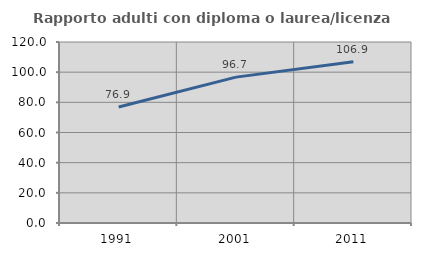
| Category | Rapporto adulti con diploma o laurea/licenza media  |
|---|---|
| 1991.0 | 76.86 |
| 2001.0 | 96.711 |
| 2011.0 | 106.878 |